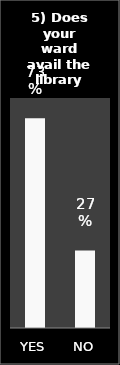
| Category | Series 0 |
|---|---|
| YES | 0.73 |
| NO | 0.27 |